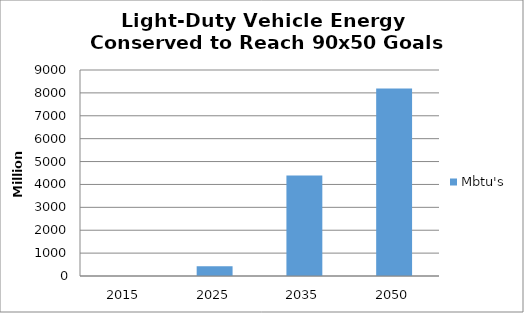
| Category | Mbtu's |
|---|---|
| 2015.0 | 0 |
| 2025.0 | 430.944 |
| 2035.0 | 4387.795 |
| 2050.0 | 8187.939 |